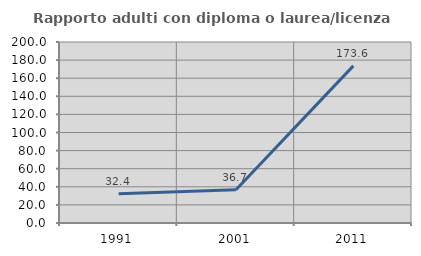
| Category | Rapporto adulti con diploma o laurea/licenza media  |
|---|---|
| 1991.0 | 32.384 |
| 2001.0 | 36.701 |
| 2011.0 | 173.585 |